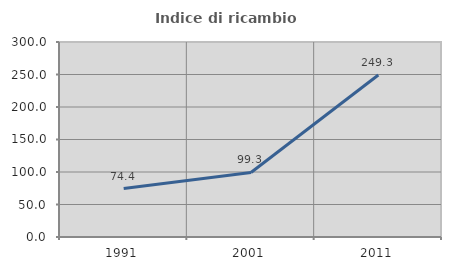
| Category | Indice di ricambio occupazionale  |
|---|---|
| 1991.0 | 74.444 |
| 2001.0 | 99.286 |
| 2011.0 | 249.275 |